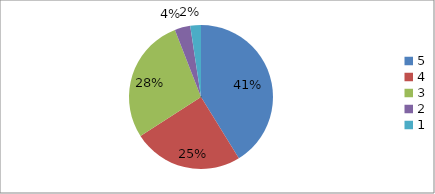
| Category | Series 0 | Series 1 |
|---|---|---|
| 5.0 | 41.2 | 41.2 |
| 4.0 | 24.7 | 24.7 |
| 3.0 | 28.2 | 28.2 |
| 2.0 | 3.5 | 3.5 |
| 1.0 | 2.4 | 2.4 |